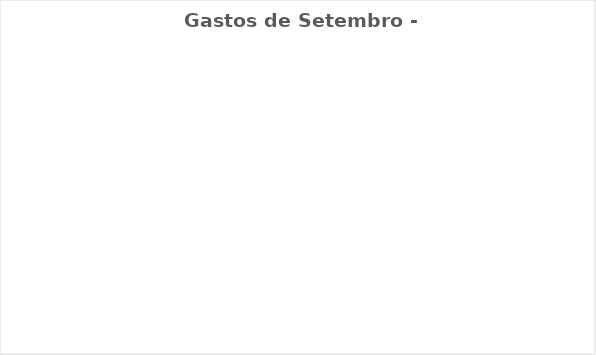
| Category | Gastos de Setembro - Real |
|---|---|
| Despesas Mensais | 0 |
| Aposentadoria/Pagar à si | 0 |
| Gratidão/ Doação/ Dizimo | 0 |
| Desejos | 0 |
| Dívidas/Investimentos | 0 |